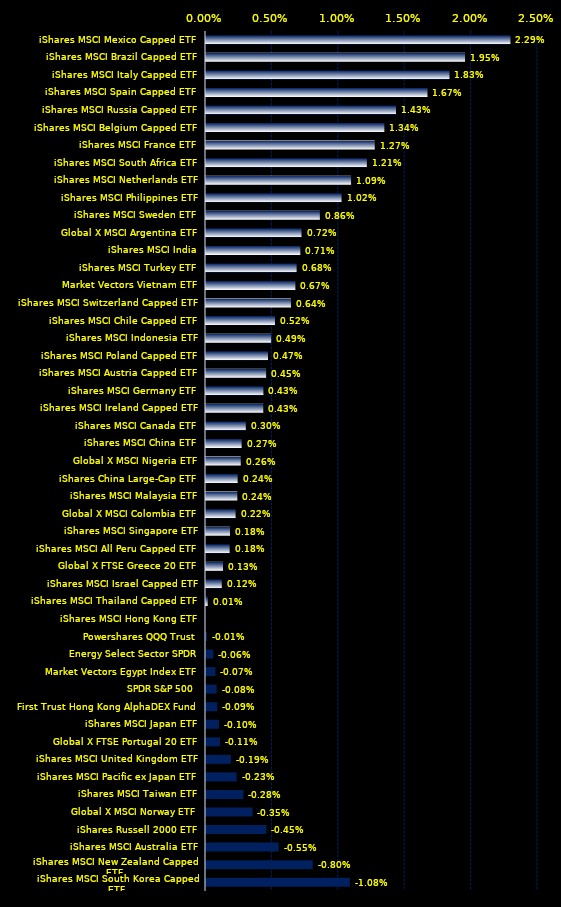
| Category | Series 0 | Series 1 |
|---|---|---|
| iShares MSCI Mexico Capped ETF | 0.023 | 0 |
| iShares MSCI Brazil Capped ETF | 0.02 | 0 |
| iShares MSCI Italy Capped ETF | 0.018 | 0 |
| iShares MSCI Spain Capped ETF | 0.017 | 0 |
| iShares MSCI Russia Capped ETF | 0.014 | 0 |
| iShares MSCI Belgium Capped ETF | 0.013 | 0 |
| iShares MSCI France ETF | 0.013 | 0 |
| iShares MSCI South Africa ETF | 0.012 | 0 |
| iShares MSCI Netherlands ETF | 0.011 | 0 |
| iShares MSCI Philippines ETF | 0.01 | 0 |
| iShares MSCI Sweden ETF | 0.009 | 0 |
| Global X MSCI Argentina ETF | 0.007 | 0 |
| iShares MSCI India | 0.007 | 0 |
| iShares MSCI Turkey ETF | 0.007 | 0 |
| Market Vectors Vietnam ETF | 0.007 | 0 |
| iShares MSCI Switzerland Capped ETF | 0.006 | 0 |
| iShares MSCI Chile Capped ETF | 0.005 | 0 |
| iShares MSCI Indonesia ETF | 0.005 | 0 |
| iShares MSCI Poland Capped ETF | 0.005 | 0 |
| iShares MSCI Austria Capped ETF | 0.005 | 0 |
| iShares MSCI Germany ETF | 0.004 | 0 |
| iShares MSCI Ireland Capped ETF | 0.004 | 0 |
| iShares MSCI Canada ETF | 0.003 | 0 |
| iShares MSCI China ETF | 0.003 | 0 |
| Global X MSCI Nigeria ETF | 0.003 | 0 |
| iShares China Large-Cap ETF | 0.002 | 0 |
| iShares MSCI Malaysia ETF | 0.002 | 0 |
| Global X MSCI Colombia ETF | 0.002 | 0 |
| iShares MSCI Singapore ETF | 0.002 | 0 |
| iShares MSCI All Peru Capped ETF | 0.002 | 0 |
| Global X FTSE Greece 20 ETF | 0.001 | 0 |
| iShares MSCI Israel Capped ETF | 0.001 | 0 |
| iShares MSCI Thailand Capped ETF | 0 | 0 |
| iShares MSCI Hong Kong ETF | 0 | 0 |
| Powershares QQQ Trust | 0 | 0 |
| Energy Select Sector SPDR | 0 | 0.001 |
| Market Vectors Egypt Index ETF | 0 | 0.001 |
| SPDR S&P 500 | 0 | 0.001 |
| First Trust Hong Kong AlphaDEX Fund | 0 | 0.001 |
| iShares MSCI Japan ETF | 0 | 0.001 |
| Global X FTSE Portugal 20 ETF | 0 | 0.001 |
| iShares MSCI United Kingdom ETF | 0 | 0.002 |
| iShares MSCI Pacific ex Japan ETF | 0 | 0.002 |
| iShares MSCI Taiwan ETF | 0 | 0.003 |
| Global X MSCI Norway ETF | 0 | 0.003 |
| iShares Russell 2000 ETF | 0 | 0.005 |
| iShares MSCI Australia ETF | 0 | 0.005 |
| iShares MSCI New Zealand Capped ETF | 0 | 0.008 |
| iShares MSCI South Korea Capped ETF | 0 | 0.011 |